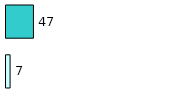
| Category | Series 0 | Series 1 |
|---|---|---|
| 0 | 7 | 47 |